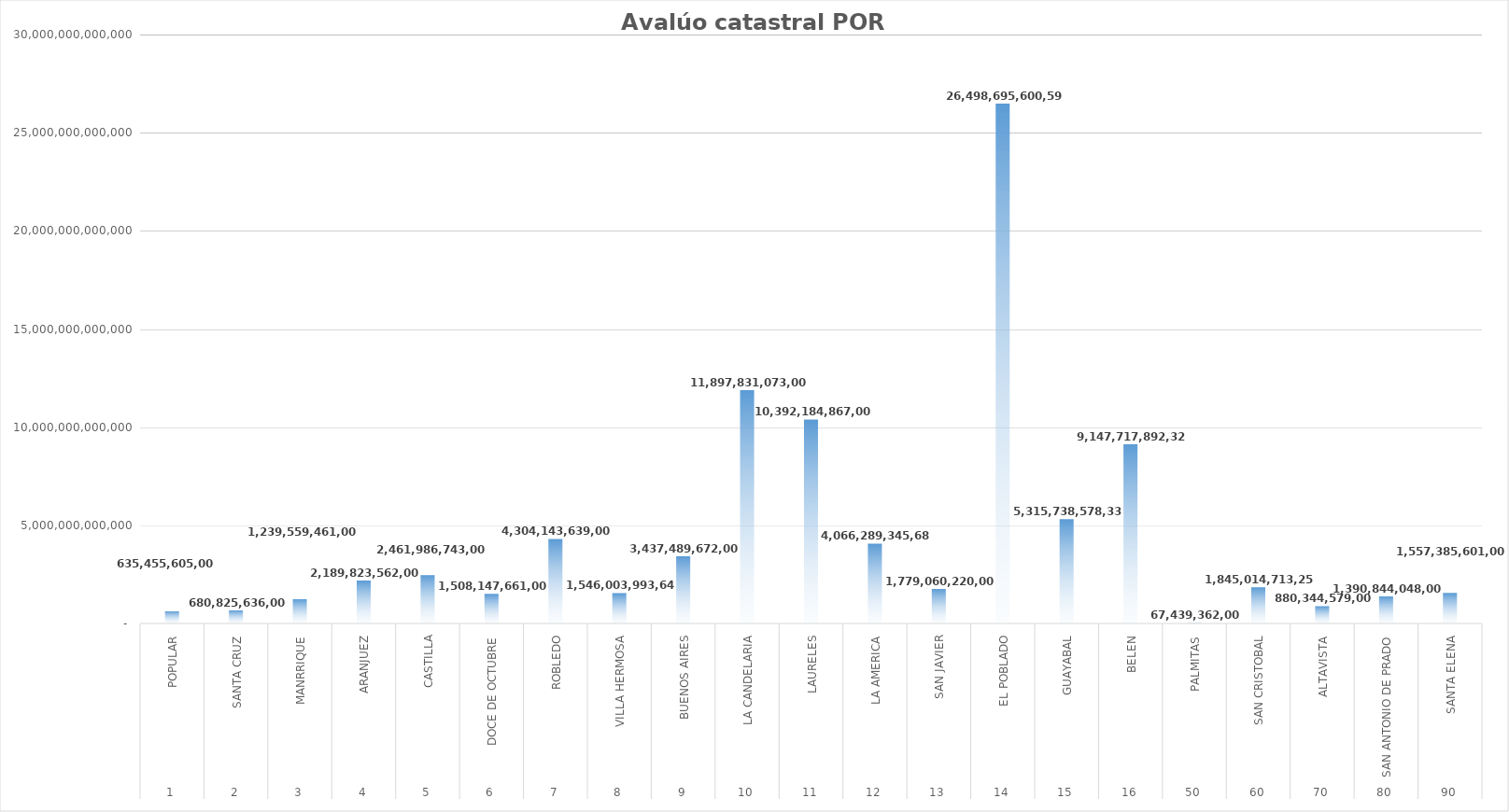
| Category | Avalúo Total |
|---|---|
| 0 | 635455605000 |
| 1 | 680825636000 |
| 2 | 1239559461000 |
| 3 | 2189823562000 |
| 4 | 2461986743000 |
| 5 | 1508147661000 |
| 6 | 4304143639000 |
| 7 | 1546003993640 |
| 8 | 3437489672000 |
| 9 | 11897831073000 |
| 10 | 10392184867000 |
| 11 | 4066289345680 |
| 12 | 1779060220000 |
| 13 | 26498695600596 |
| 14 | 5315738578336 |
| 15 | 9147717892320 |
| 16 | 67439362000 |
| 17 | 1845014713257 |
| 18 | 880344579000 |
| 19 | 1390844048000 |
| 20 | 1557385601000 |